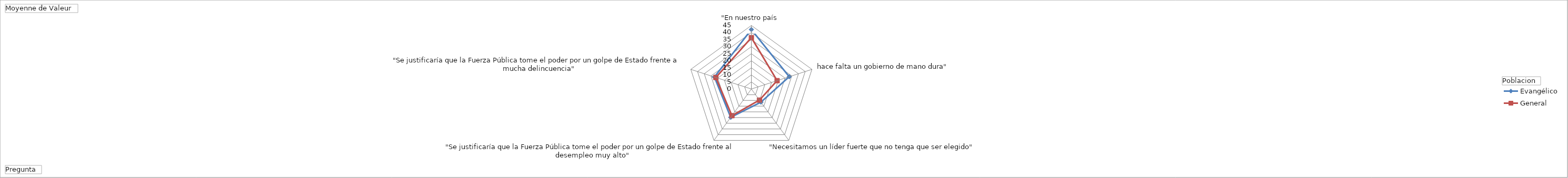
| Category | Evangélico | General |
|---|---|---|
| "En nuestro país, hace falta un gobierno de mano dura" | 42.11 | 36.397 |
| "Necesitamos un líder fuerte que no tenga que ser elegido" | 28.115 | 19.13 |
| "Se justificaría que la Fuerza Pública tome el poder por un golpe de Estado frente al desempleo muy alto" | 11.51 | 9.73 |
| "Se justificaría que la Fuerza Pública tome el poder por un golpe de Estado frente a mucha delincuencia" | 24.827 | 23.357 |
| "Se justificaría que la Fuerza Pública tome el poder por un golpe de Estado frente a mucha corrupción" | 27.45 | 26.363 |